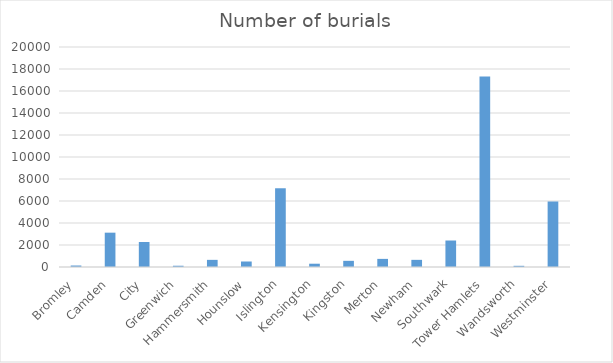
| Category | Number of burials |
|---|---|
| Bromley | 135 |
| Camden | 3121 |
| City | 2271 |
| Greenwich | 115 |
| Hammersmith | 649 |
| Hounslow | 500 |
| Islington | 7158 |
| Kensington | 299 |
| Kingston | 561 |
| Merton | 738 |
| Newham | 650 |
| Southwark | 2408 |
| Tower Hamlets | 17323 |
| Wandsworth | 108 |
| Westminster | 5955 |